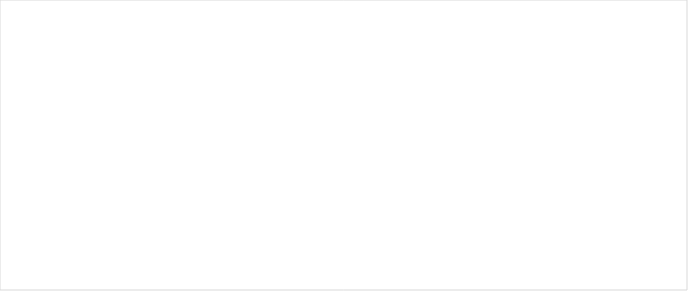
| Category | RESERVAS CONSTITUIDAS
 | CANCELACIONES RESERVAS PRESUPUESTALES
  | PAGOS
ACUMULADOS
 |
|---|---|---|---|
| A-FUNCIONAMIENTO | 2249.649 | 0 | 0.735 |
| C-INVERSIÓN | 53197.266 | 0 | 8351.136 |